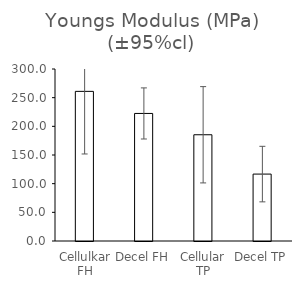
| Category | Series 0 |
|---|---|
| Cellulkar FH | 260.994 |
| Decel FH | 222.473 |
| Cellular TP | 185.296 |
| Decel TP | 116.705 |